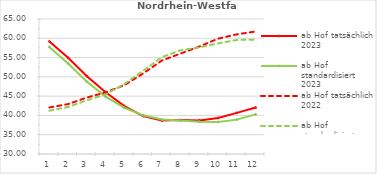
| Category | ab Hof tatsächlich 2023 | ab Hof standardisiert 2023 | ab Hof tatsächlich 2022 | ab Hof standardisiert 2022 |
|---|---|---|---|---|
| 0 | 59.18 | 57.723 | 42.056 | 41.211 |
| 1 | 54.927 | 53.449 | 42.94 | 42.201 |
| 2 | 50.166 | 48.723 | 44.636 | 43.929 |
| 3 | 46.02 | 44.869 | 45.969 | 45.471 |
| 4 | 42.437 | 41.995 | 47.852 | 48.133 |
| 5 | 39.837 | 40.028 | 50.868 | 51.578 |
| 6 | 38.659 | 38.934 | 54.234 | 55.106 |
| 7 | 38.82 | 38.701 | 56.054 | 56.883 |
| 8 | 38.703 | 38.371 | 57.87 | 57.646 |
| 9 | 39.349 | 38.302 | 59.914 | 58.666 |
| 10 | 40.669 | 38.914 | 61.031 | 59.564 |
| 11 | 42.036 | 40.282 | 61.76 | 59.654 |